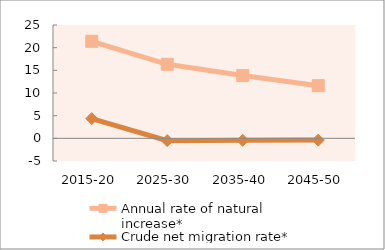
| Category | Annual rate of natural increase* | Crude net migration rate* |
|---|---|---|
| 2015-20 | 21.409 | 4.353 |
| 2025-30 | 16.331 | -0.512 |
| 2035-40 | 13.848 | -0.443 |
| 2045-50 | 11.619 | -0.392 |